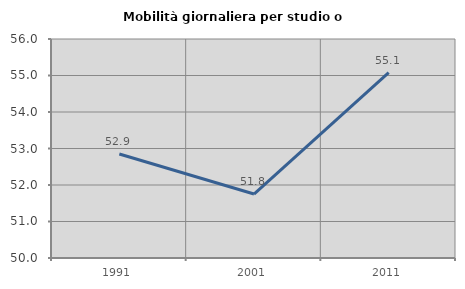
| Category | Mobilità giornaliera per studio o lavoro |
|---|---|
| 1991.0 | 52.85 |
| 2001.0 | 51.753 |
| 2011.0 | 55.079 |